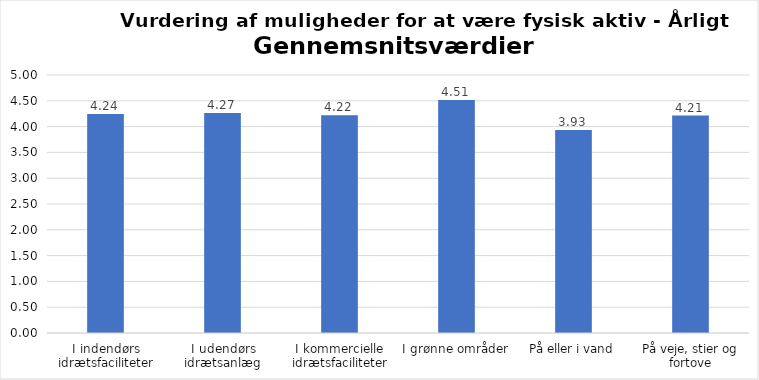
| Category | Gennemsnit |
|---|---|
| I indendørs idrætsfaciliteter | 4.245 |
| I udendørs idrætsanlæg | 4.266 |
| I kommercielle idrætsfaciliteter | 4.219 |
| I grønne områder | 4.514 |
| På eller i vand | 3.932 |
| På veje, stier og fortove | 4.215 |